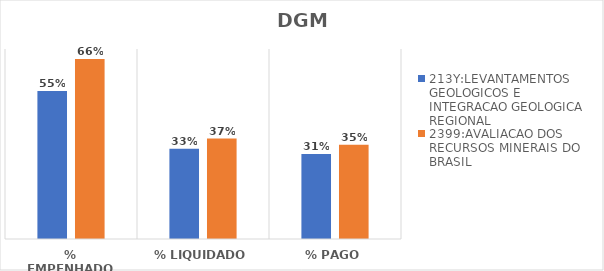
| Category | 213Y:LEVANTAMENTOS GEOLOGICOS E INTEGRACAO GEOLOGICA REGIONAL | 2399:AVALIACAO DOS RECURSOS MINERAIS DO BRASIL |
|---|---|---|
| % EMPENHADO | 0.546 | 0.663 |
| % LIQUIDADO | 0.332 | 0.37 |
| % PAGO | 0.313 | 0.347 |